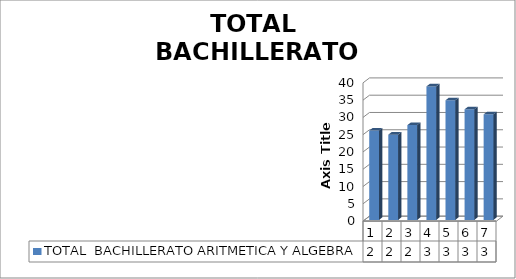
| Category | TOTAL  BACHILLERATO ARITMETICA Y ALGEBRA |
|---|---|
| 0 | 25.86 |
| 1 | 24.67 |
| 2 | 27.42 |
| 3 | 38.63 |
| 4 | 34.62 |
| 5 | 32 |
| 6 | 30.533 |